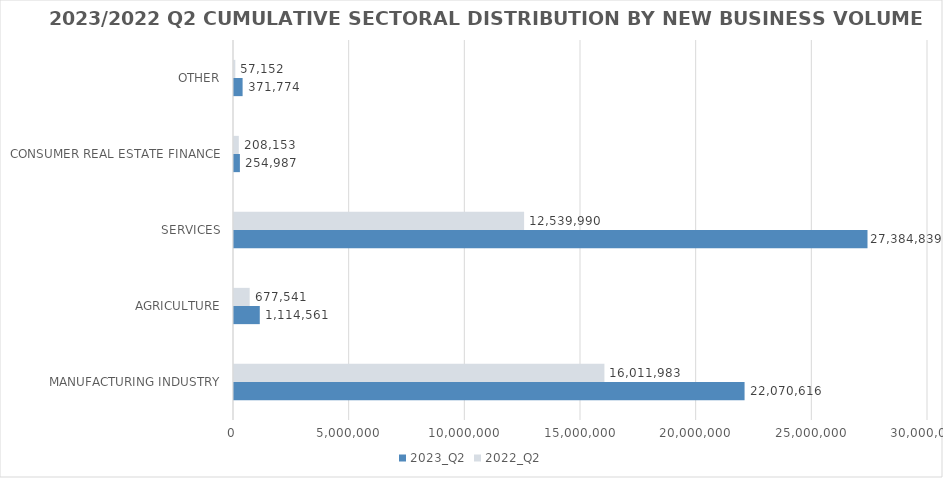
| Category | 2023_Q2 | 2022_Q2 |
|---|---|---|
| MANUFACTURING INDUSTRY | 22070616.417 | 16011983.02 |
| AGRICULTURE | 1114560.537 | 677541.183 |
| SERVICES | 27384839.005 | 12539990.332 |
| CONSUMER REAL ESTATE FINANCE | 254987 | 208153 |
| OTHER | 371774 | 57152 |